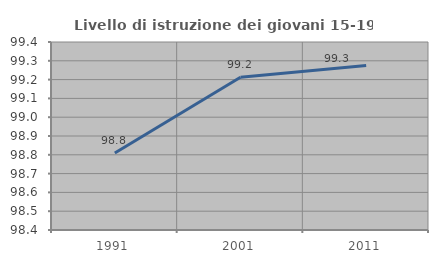
| Category | Livello di istruzione dei giovani 15-19 anni |
|---|---|
| 1991.0 | 98.81 |
| 2001.0 | 99.213 |
| 2011.0 | 99.275 |